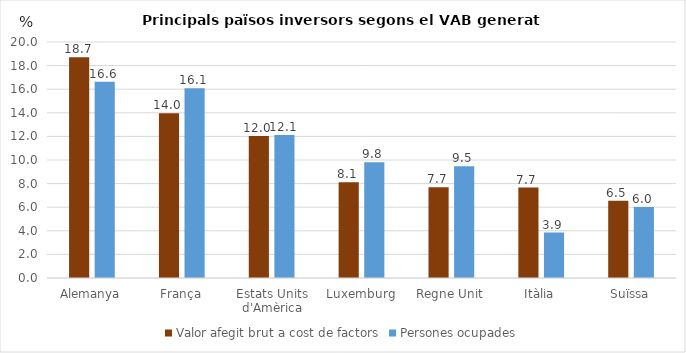
| Category | Valor afegit brut a cost de factors | Persones ocupades |
|---|---|---|
| Alemanya | 18.711 | 16.635 |
| França | 13.956 | 16.09 |
| Estats Units d'Amèrica | 12.042 | 12.11 |
| Luxemburg | 8.117 | 9.811 |
| Regne Unit | 7.691 | 9.477 |
| Itàlia | 7.662 | 3.851 |
| Suïssa | 6.538 | 6.022 |